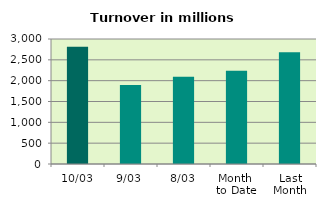
| Category | Series 0 |
|---|---|
| 10/03 | 2813.746 |
| 9/03 | 1896.792 |
| 8/03 | 2092.626 |
| Month 
to Date | 2239.182 |
| Last
Month | 2679.99 |